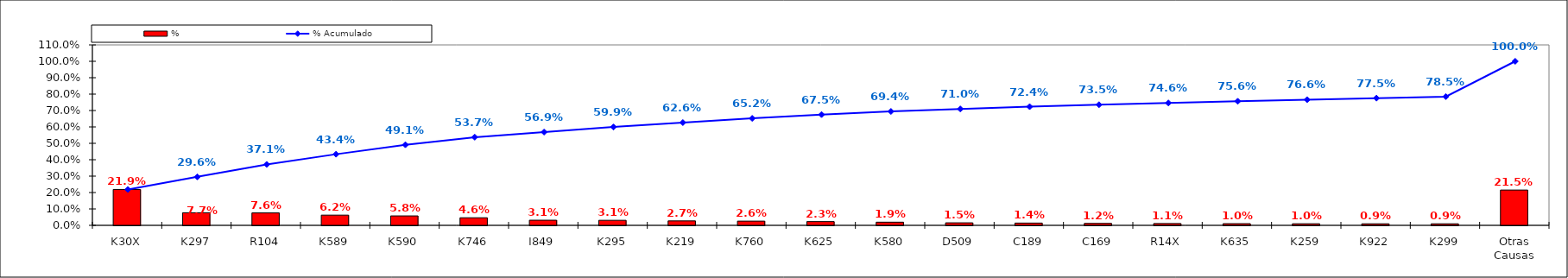
| Category | % |
|---|---|
| K30X | 0.219 |
| K297 | 0.077 |
| R104 | 0.076 |
| K589 | 0.062 |
| K590 | 0.058 |
| K746 | 0.046 |
| I849 | 0.031 |
| K295 | 0.031 |
| K219 | 0.027 |
| K760 | 0.026 |
| K625 | 0.023 |
| K580 | 0.019 |
| D509 | 0.015 |
| C189 | 0.014 |
| C169 | 0.012 |
| R14X | 0.011 |
| K635 | 0.01 |
| K259 | 0.01 |
| K922 | 0.009 |
| K299 | 0.009 |
| Otras Causas | 0.215 |